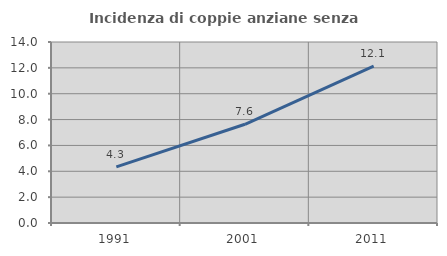
| Category | Incidenza di coppie anziane senza figli  |
|---|---|
| 1991.0 | 4.338 |
| 2001.0 | 7.637 |
| 2011.0 | 12.135 |